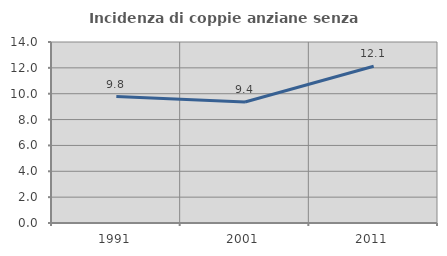
| Category | Incidenza di coppie anziane senza figli  |
|---|---|
| 1991.0 | 9.783 |
| 2001.0 | 9.365 |
| 2011.0 | 12.121 |